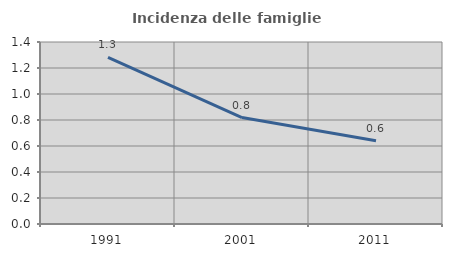
| Category | Incidenza delle famiglie numerose |
|---|---|
| 1991.0 | 1.282 |
| 2001.0 | 0.818 |
| 2011.0 | 0.64 |